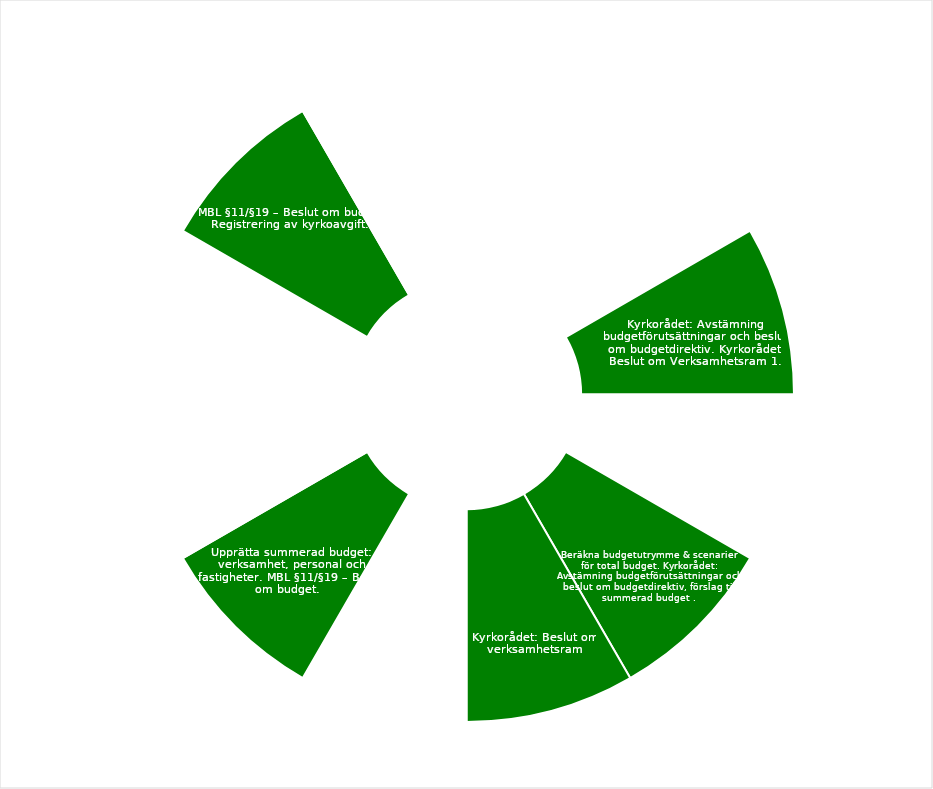
| Category | Series 0 |
|---|---|
|  | 1 |
|  | 1 |
| Kyrkorådet: Avstämning budgetförutsättningar och beslut om budgetdirektiv. Kyrkorådet: Beslut om Verksamhetsram 1.  | 1 |
|  | 1 |
| Beräkna budgetutrymme & scenarier för total budget. Kyrkorådet: Avstämning budgetförutsättningar och beslut om budgetdirektiv, förslag till summerad budget . | 1 |
| Kyrkorådet: Beslut om
verksamhetsram
 | 1 |
|  | 1 |
| Upprätta summerad budget: verksamhet, personal och fastigheter. MBL §11/§19 – Beslut om budget.  | 1 |
|  | 1 |
|  | 1 |
| MBL §11/§19 – Beslut om budget. Registrering av kyrkoavgift.  | 1 |